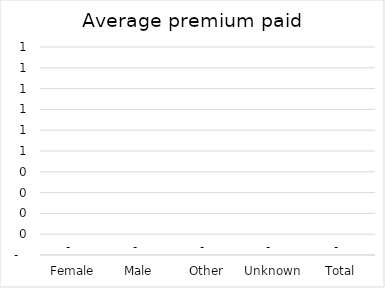
| Category |  Average premium paid  |
|---|---|
| Female | 0 |
| Male | 0 |
| Other | 0 |
| Unknown | 0 |
| Total | 0 |